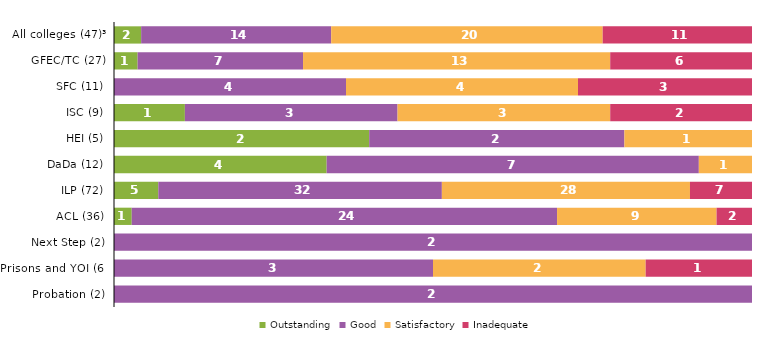
| Category | Outstanding | Good | Satisfactory | Inadequate |
|---|---|---|---|---|
| All colleges (47)³ | 2 | 14 | 20 | 11 |
| GFEC/TC (27) | 1 | 7 | 13 | 6 |
| SFC (11) | 0 | 4 | 4 | 3 |
| ISC (9) | 1 | 3 | 3 | 2 |
| HEI (5) | 2 | 2 | 1 | 0 |
| DaDa (12) | 4 | 7 | 1 | 0 |
| ILP (72) | 5 | 32 | 28 | 7 |
| ACL (36) | 1 | 24 | 9 | 2 |
| Next Step (2) | 0 | 2 | 0 | 0 |
| Prisons and YOI (6) | 0 | 3 | 2 | 1 |
| Probation (2) | 0 | 2 | 0 | 0 |